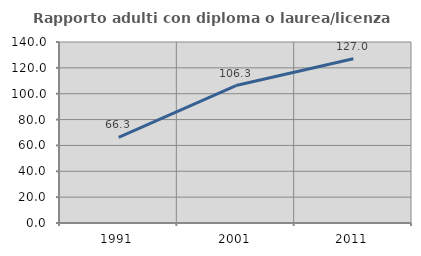
| Category | Rapporto adulti con diploma o laurea/licenza media  |
|---|---|
| 1991.0 | 66.279 |
| 2001.0 | 106.306 |
| 2011.0 | 127.027 |